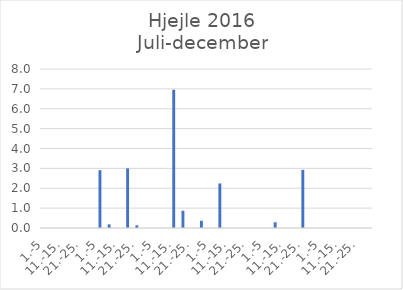
| Category | Series 0 |
|---|---|
| 1.-5 | 0 |
| 6.-10. | 0 |
| 11.-15. | 0 |
| 16.-20. | 0 |
| 21.-25. | 0 |
| 26.-31. | 0 |
| 1.-5 | 2.909 |
| 6.-10. | 0.184 |
| 11.-15. | 0 |
| 16.-20. | 3 |
| 21.-25. | 0.135 |
| 26.-31. | 0 |
| 1.-5 | 0 |
| 6.-10. | 0 |
| 11.-15. | 6.956 |
| 16.-20. | 0.868 |
| 21.-25. | 0 |
| 26.-30. | 0.366 |
| 1.-5 | 0 |
| 6.-10. | 2.241 |
| 11.-15. | 0 |
| 16.-20. | 0 |
| 21.-25. | 0 |
| 26.-31. | 0 |
| 1.-5 | 0 |
| 6.-10. | 0.289 |
| 11.-15. | 0 |
| 16.-20. | 0 |
| 21.-25. | 2.927 |
| 26.-30. | 0 |
| 1.-5 | 0 |
| 6.-10. | 0 |
| 11.-15. | 0 |
| 16.-20. | 0 |
| 21.-25. | 0 |
| 26.-31. | 0 |